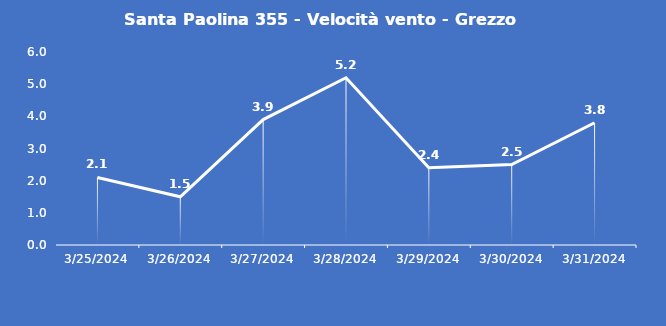
| Category | Santa Paolina 355 - Velocità vento - Grezzo (m/s) |
|---|---|
| 3/25/24 | 2.1 |
| 3/26/24 | 1.5 |
| 3/27/24 | 3.9 |
| 3/28/24 | 5.2 |
| 3/29/24 | 2.4 |
| 3/30/24 | 2.5 |
| 3/31/24 | 3.8 |